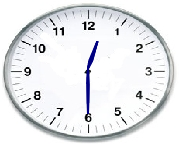
| Category | Series 0 |
|---|---|
| 0.0 | 0 |
| 0.030467335851286872 | 0.248 |
| 0.23293714059226867 | 0.869 |
| 0.09768278212231843 | 0.23 |
| 0.0 | 0 |
| 0.04770224884413623 | 0.245 |
| 0.23293714059226867 | 0.869 |
| 0.08139203861428919 | 0.236 |
| 0.0 | 0 |
| 0.017449748351250197 | -0.5 |
| -2.6646978894262485e-16 | -1.45 |
| 0.008726203218641565 | -0.5 |
| 0.0 | 0 |
| -0.01744974835125038 | -0.5 |
| -2.6646978894262485e-16 | -1.45 |
| -0.008726203218641749 | -0.5 |
| 0.0 | 0 |